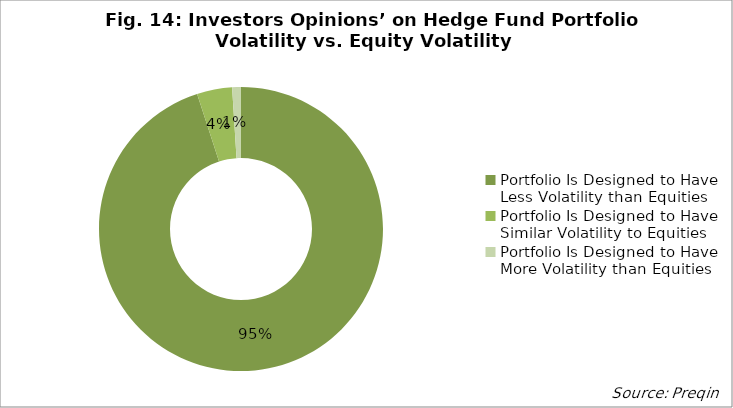
| Category | Series 0 |
|---|---|
| Portfolio Is Designed to Have Less Volatility than Equities | 0.95 |
| Portfolio Is Designed to Have Similar Volatility to Equities | 0.04 |
| Portfolio Is Designed to Have More Volatility than Equities | 0.01 |